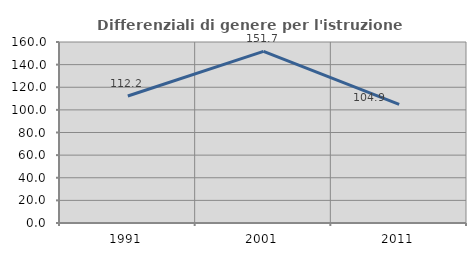
| Category | Differenziali di genere per l'istruzione superiore |
|---|---|
| 1991.0 | 112.241 |
| 2001.0 | 151.742 |
| 2011.0 | 104.895 |